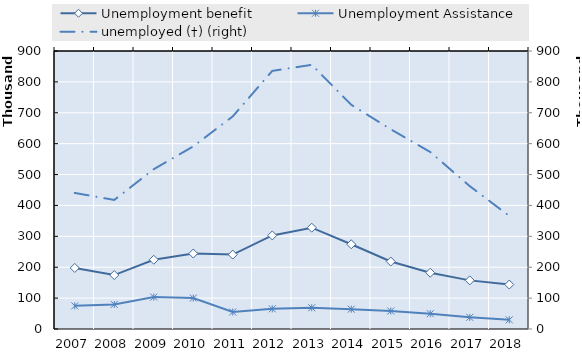
| Category | Unemployment benefit | Unemployment Assistance |
|---|---|---|
| 2007.0 | 197691.333 | 74899 |
| 2008.0 | 174615.083 | 79633 |
| 2009.0 | 224197.667 | 103232 |
| 2010.0 | 244319 | 100067 |
| 2011.0 | 240868 | 55104 |
| 2012.0 | 302924 | 65206 |
| 2013.0 | 328028 | 68779 |
| 2014.0 | 274355 | 64125 |
| 2015.0 | 218492 | 58233 |
| 2016.0 | 182161 | 49603 |
| 2017.0 | 157412 | 37723 |
| 2018.0 | 143884 | 29767 |